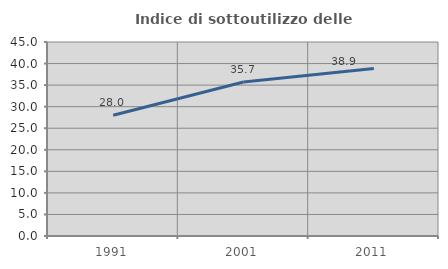
| Category | Indice di sottoutilizzo delle abitazioni  |
|---|---|
| 1991.0 | 28.025 |
| 2001.0 | 35.732 |
| 2011.0 | 38.853 |